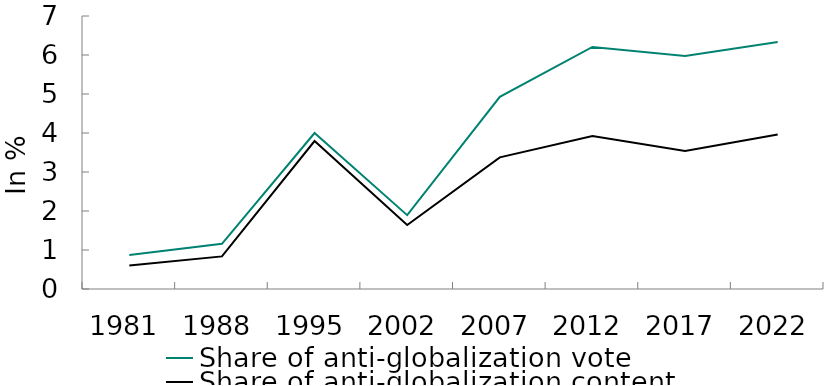
| Category | Share of anti-globalization vote | Share of anti-globalization content |
|---|---|---|
| 1981.0 | 0.87 | 0.605 |
| 1988.0 | 1.159 | 0.836 |
| 1995.0 | 3.999 | 3.794 |
| 2002.0 | 1.894 | 1.641 |
| 2007.0 | 4.927 | 3.376 |
| 2012.0 | 6.205 | 3.925 |
| 2017.0 | 5.977 | 3.54 |
| 2022.0 | 6.334 | 3.962 |